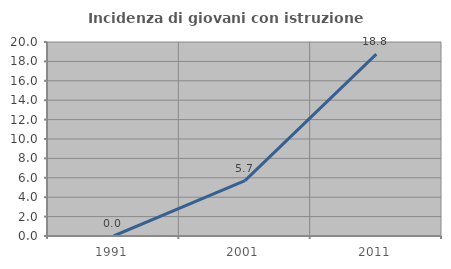
| Category | Incidenza di giovani con istruzione universitaria |
|---|---|
| 1991.0 | 0 |
| 2001.0 | 5.714 |
| 2011.0 | 18.75 |